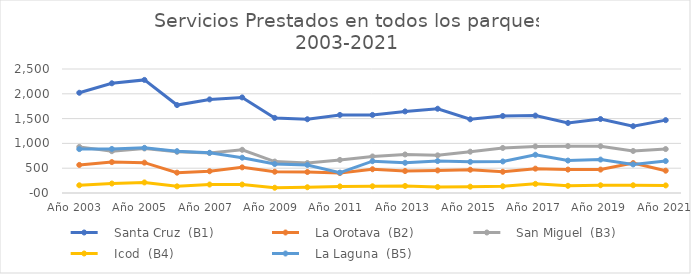
| Category |    Santa Cruz  (B1) |    La Orotava  (B2) |    San Miguel  (B3) |    Icod  (B4) |    La Laguna  (B5) |
|---|---|---|---|---|---|
| Año 2003   | 2021 | 566 | 930 | 156 | 885 |
| Año 2004   | 2212 | 623 | 843 | 191 | 888 |
| Año 2005   | 2280 | 612 | 898 | 213 | 910 |
| Año 2006   | 1773 | 410 | 830 | 134 | 843 |
| Año 2007   | 1887 | 439 | 807 | 171 | 811 |
| Año 2008   | 1927 | 517 | 871 | 171 | 712 |
| Año 2009   | 1514 | 429 | 634 | 106 | 584 |
| Año 2010 | 1487 | 423 | 604 | 116 | 566 |
| Año 2011   | 1574 | 402 | 667 | 133 | 411 |
| Año 2012   | 1574 | 479 | 737 | 136 | 641 |
| Año 2013  | 1645 | 443 | 777 | 142 | 609 |
| Año 2014 | 1699 | 455 | 759 | 121 | 644 |
| Año 2015 | 1486 | 469 | 833 | 128 | 628 |
| Año 2016 | 1553 | 428 | 908 | 136 | 636 |
| Año 2017 | 1561 | 491 | 939 | 184 | 771 |
| Año 2018 | 1412 | 472 | 945 | 145 | 654 |
| Año 2019  | 1491 | 472 | 942 | 156 | 674 |
| Año 2020 | 1347 | 603 | 847 | 156 | 576 |
| Año 2021 | 1469 | 450 | 886 | 153 | 644 |